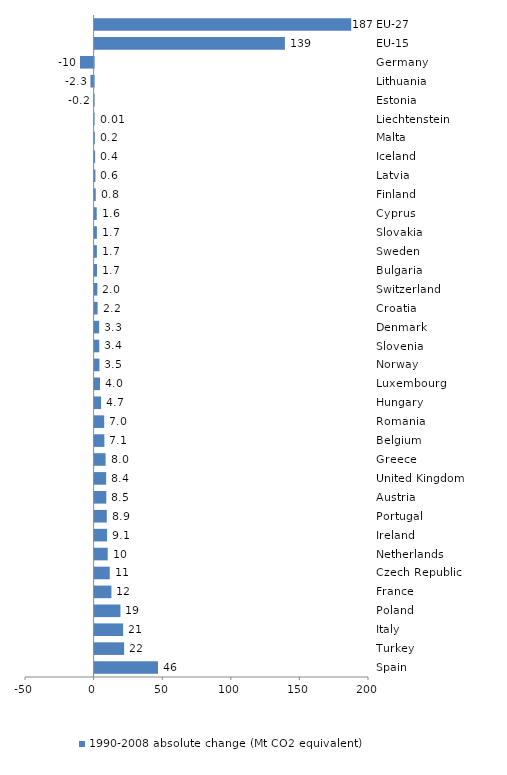
| Category | 1990-2008 absolute change (Mt CO2 equivalent) |
|---|---|
| EU-27 | 187.016 |
| EU-15 | 138.723 |
| Germany | -9.922 |
| Lithuania | -2.286 |
| Estonia | -0.154 |
| Liechtenstein | 0.015 |
| Malta | 0.184 |
| Iceland | 0.353 |
| Latvia | 0.592 |
| Finland | 0.842 |
| Cyprus | 1.554 |
| Slovakia | 1.671 |
| Sweden | 1.677 |
| Bulgaria | 1.742 |
| Switzerland | 2.009 |
| Croatia | 2.183 |
| Denmark | 3.308 |
| Slovenia | 3.403 |
| Norway | 3.536 |
| Luxembourg | 3.953 |
| Hungary | 4.712 |
| Romania | 6.992 |
| Belgium | 7.122 |
| Greece | 8.01 |
| United Kingdom | 8.42 |
| Austria | 8.532 |
| Portugal | 8.89 |
| Ireland | 9.074 |
| Netherlands | 9.553 |
| Czech Republic | 11.051 |
| France | 12.262 |
| Poland | 18.832 |
| Italy | 20.79 |
| Turkey | 21.518 |
| Spain | 46.214 |